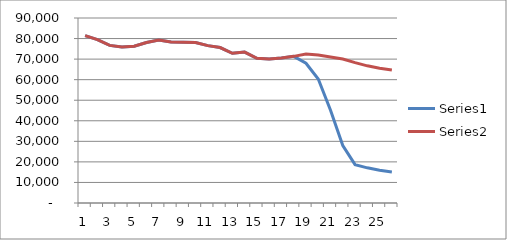
| Category | Series 0 | Series 1 |
|---|---|---|
| 0 | 81437 | 81437 |
| 1 | 79474 | 79474 |
| 2 | 76682 | 76682 |
| 3 | 75935 | 75935 |
| 4 | 76300 | 76300 |
| 5 | 78068 | 78068 |
| 6 | 79332 | 79332 |
| 7 | 78321 | 78321 |
| 8 | 78229 | 78229 |
| 9 | 78108 | 78108 |
| 10 | 76552 | 76552 |
| 11 | 75633 | 75633 |
| 12 | 72813 | 72813 |
| 13 | 73438 | 73438 |
| 14 | 70429 | 70429 |
| 15 | 70094 | 70094 |
| 16 | 70592 | 70592 |
| 17 | 71343 | 71343 |
| 18 | 67994 | 72508 |
| 19 | 60327 | 72007 |
| 20 | 45154 | 71001 |
| 21 | 27964 | 70027 |
| 22 | 18662 | 68287 |
| 23 | 17102 | 66727 |
| 24 | 15969 | 65594 |
| 25 | 15054 | 64679 |